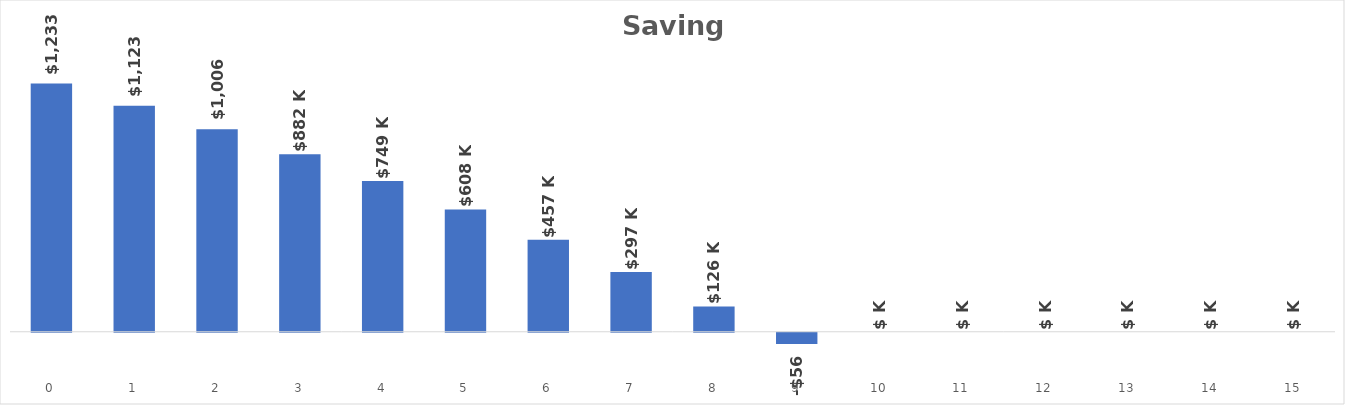
| Category | Savings |
|---|---|
| 0.0 | 1233000 |
| 1.0 | 1123145 |
| 2.0 | 1006149.425 |
| 3.0 | 881549.138 |
| 4.0 | 748849.832 |
| 5.0 | 607525.071 |
| 6.0 | 457014.2 |
| 7.0 | 296720.123 |
| 8.0 | 126006.931 |
| 9.0 | -55802.618 |
| 10.0 | 0 |
| 11.0 | 0 |
| 12.0 | 0 |
| 13.0 | 0 |
| 14.0 | 0 |
| 15.0 | 0 |